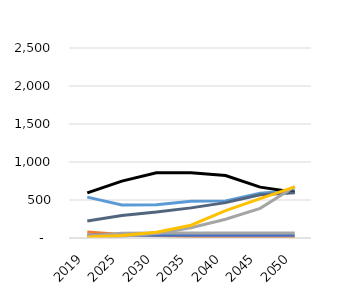
| Category | liquids | natural gas | coal | nuclear | hydro | other | wind | solar |
|---|---|---|---|---|---|---|---|---|
| 2019.0 | 77.92 | 538.19 | 593.2 | 37.21 | 224.79 | 26.84 | 9.54 | 11.95 |
| 2025.0 | 47.72 | 435.38 | 748.86 | 37.27 | 296.98 | 61.18 | 22.06 | 33.08 |
| 2030.0 | 31.63 | 438.36 | 856.97 | 37.27 | 341.22 | 65.65 | 60 | 75.45 |
| 2035.0 | 20.73 | 483.49 | 856.97 | 37.27 | 396.31 | 65.79 | 135.22 | 168.3 |
| 2040.0 | 13.36 | 488.47 | 822.93 | 37.27 | 465.37 | 65.87 | 246.02 | 360.1 |
| 2045.0 | 8.36 | 588.35 | 669.61 | 37.27 | 570.21 | 65.95 | 389.55 | 519.07 |
| 2050.0 | 5.22 | 624.48 | 601.81 | 37.27 | 594.51 | 65.9 | 674.11 | 672.57 |